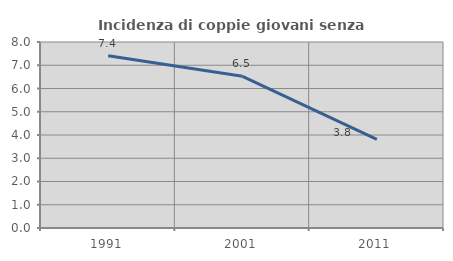
| Category | Incidenza di coppie giovani senza figli |
|---|---|
| 1991.0 | 7.411 |
| 2001.0 | 6.524 |
| 2011.0 | 3.808 |